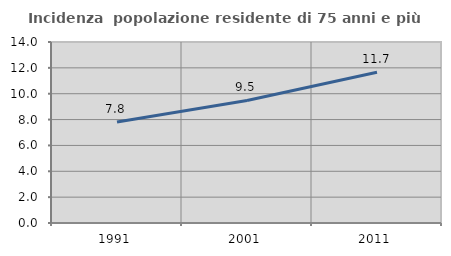
| Category | Incidenza  popolazione residente di 75 anni e più |
|---|---|
| 1991.0 | 7.818 |
| 2001.0 | 9.477 |
| 2011.0 | 11.663 |